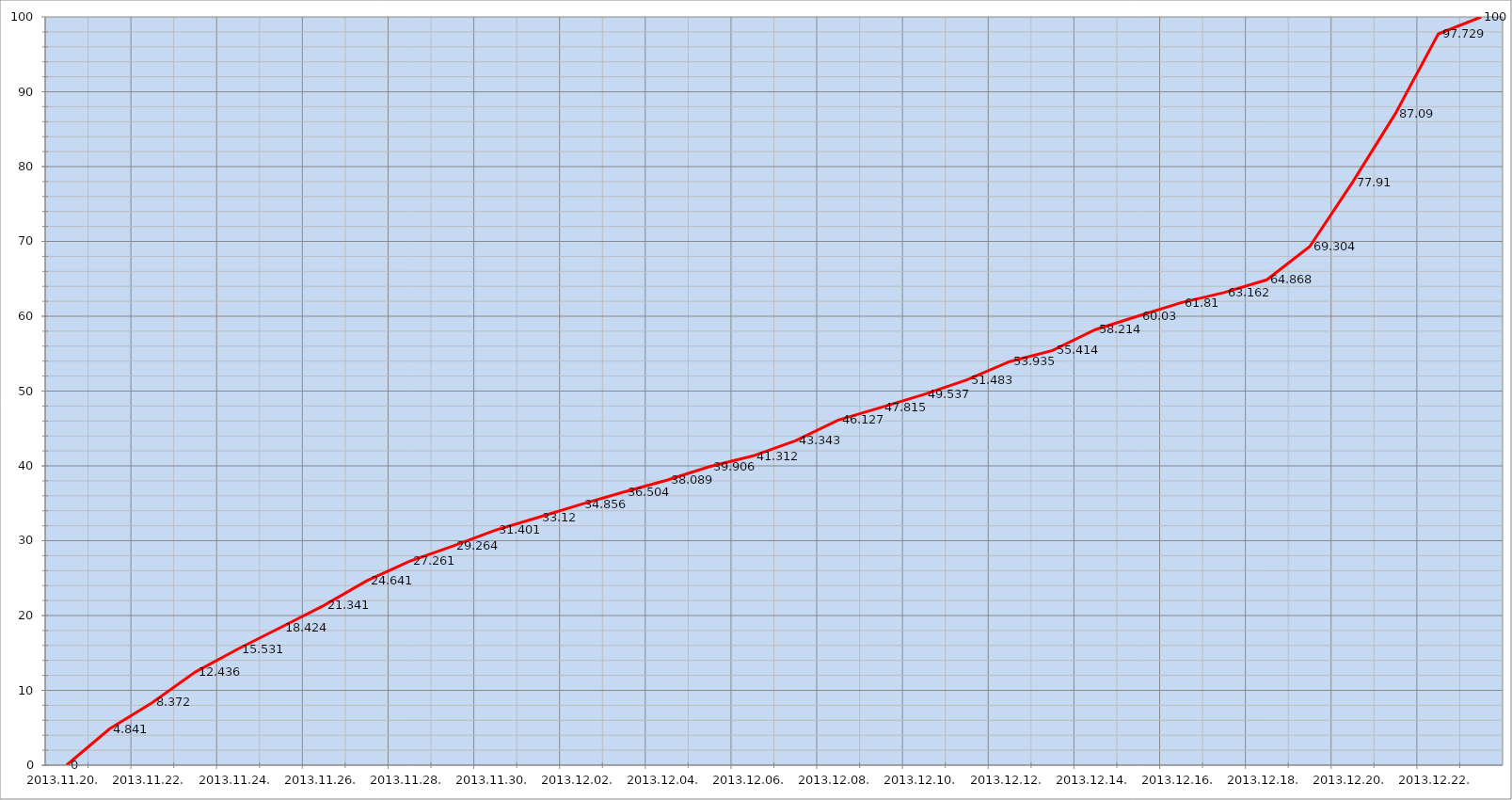
| Category | Szerver 9 |
|---|---|
| 2013-11-20 | 0 |
| 2013-11-21 | 4.841 |
| 2013-11-22 | 8.372 |
| 2013-11-23 | 12.436 |
| 2013-11-24 | 15.531 |
| 2013-11-25 | 18.424 |
| 2013-11-26 | 21.341 |
| 2013-11-27 | 24.641 |
| 2013-11-28 | 27.261 |
| 2013-11-29 | 29.264 |
| 2013-11-30 | 31.401 |
| 2013-12-01 | 33.12 |
| 2013-12-02 | 34.856 |
| 2013-12-03 | 36.504 |
| 2013-12-04 | 38.089 |
| 2013-12-05 | 39.906 |
| 2013-12-06 | 41.312 |
| 2013-12-07 | 43.343 |
| 2013-12-08 | 46.127 |
| 2013-12-09 | 47.815 |
| 2013-12-10 | 49.537 |
| 2013-12-11 | 51.483 |
| 2013-12-12 | 53.935 |
| 2013-12-13 | 55.414 |
| 2013-12-14 | 58.214 |
| 2013-12-15 | 60.03 |
| 2013-12-16 | 61.81 |
| 2013-12-17 | 63.162 |
| 2013-12-18 | 64.868 |
| 2013-12-19 | 69.304 |
| 2013-12-20 | 77.91 |
| 2013-12-21 | 87.09 |
| 2013-12-22 | 97.729 |
| 2013-12-23 | 100 |